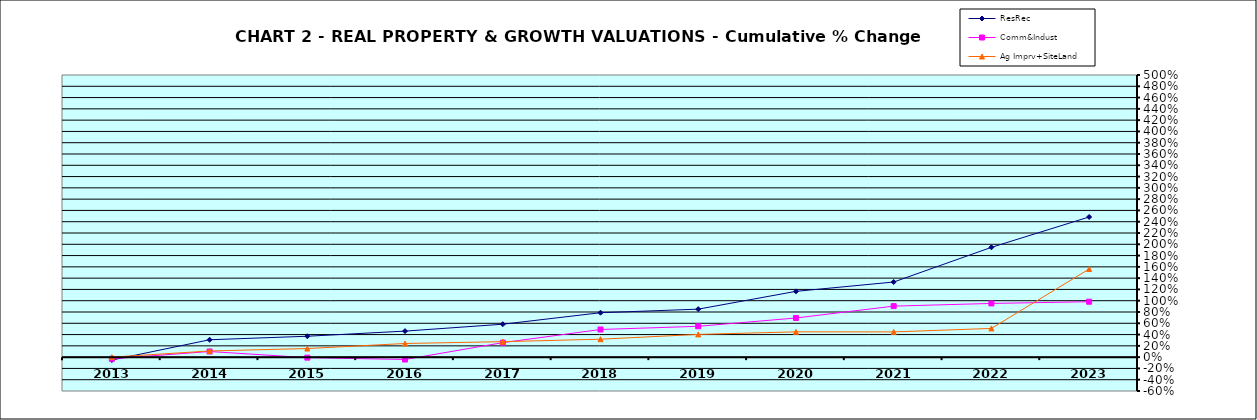
| Category | ResRec | Comm&Indust | Ag Imprv+SiteLand |
|---|---|---|---|
| 2013.0 | -0.051 | -0.029 | 0 |
| 2014.0 | 0.308 | 0.1 | 0.109 |
| 2015.0 | 0.37 | -0.009 | 0.152 |
| 2016.0 | 0.461 | -0.042 | 0.242 |
| 2017.0 | 0.584 | 0.257 | 0.274 |
| 2018.0 | 0.787 | 0.49 | 0.318 |
| 2019.0 | 0.851 | 0.546 | 0.403 |
| 2020.0 | 1.166 | 0.694 | 0.448 |
| 2021.0 | 1.331 | 0.904 | 0.447 |
| 2022.0 | 1.946 | 0.952 | 0.509 |
| 2023.0 | 2.484 | 0.982 | 1.561 |